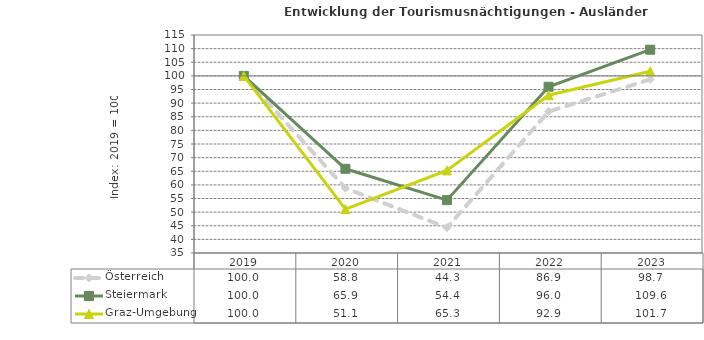
| Category | Österreich | Steiermark | Graz-Umgebung |
|---|---|---|---|
| 2023.0 | 98.7 | 109.6 | 101.7 |
| 2022.0 | 86.9 | 96 | 92.9 |
| 2021.0 | 44.3 | 54.4 | 65.3 |
| 2020.0 | 58.8 | 65.9 | 51.1 |
| 2019.0 | 100 | 100 | 100 |